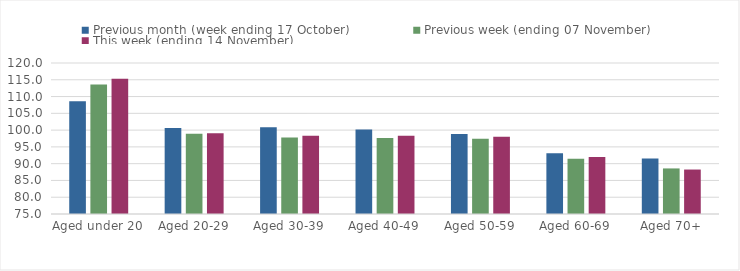
| Category | Previous month (week ending 17 October) | Previous week (ending 07 November) | This week (ending 14 November) |
|---|---|---|---|
| Aged under 20 | 108.63 | 113.61 | 115.32 |
| Aged 20-29 | 100.63 | 98.91 | 99.08 |
| Aged 30-39 | 100.83 | 97.82 | 98.35 |
| Aged 40-49 | 100.15 | 97.65 | 98.35 |
| Aged 50-59 | 98.86 | 97.43 | 98.03 |
| Aged 60-69 | 93.11 | 91.44 | 92.02 |
| Aged 70+ | 91.51 | 88.58 | 88.25 |